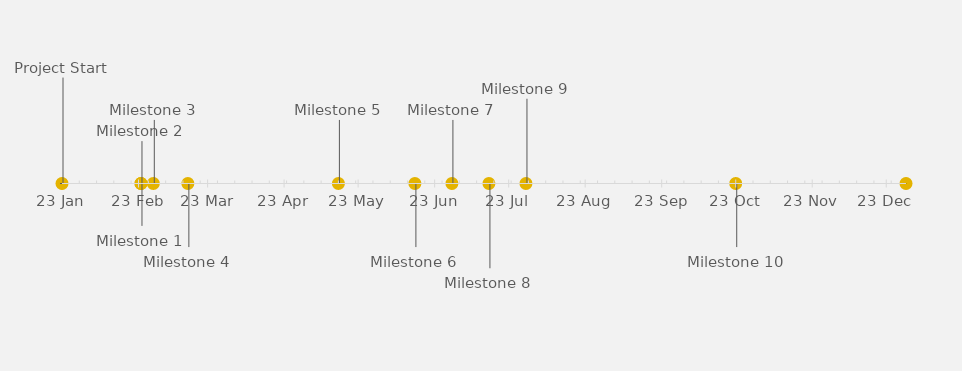
| Category | POSITION |
|---|---|
| Project Start | 25 |
| Milestone 1 | -10 |
| Milestone 2 | 10 |
| Milestone 3 | 15 |
| Milestone 4 | -15 |
| Milestone 5 | 15 |
| Milestone 6 | -15 |
| Milestone 7 | 15 |
| Milestone 8 | -20 |
| Milestone 9 | 20 |
| Milestone 10 | -15 |
| Project End | 15 |